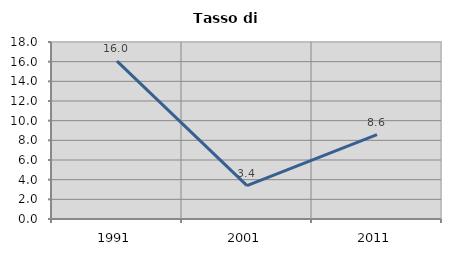
| Category | Tasso di disoccupazione   |
|---|---|
| 1991.0 | 16.049 |
| 2001.0 | 3.39 |
| 2011.0 | 8.571 |